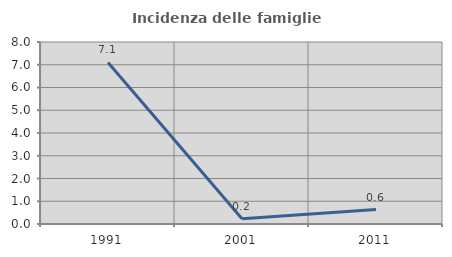
| Category | Incidenza delle famiglie numerose |
|---|---|
| 1991.0 | 7.102 |
| 2001.0 | 0.231 |
| 2011.0 | 0.633 |